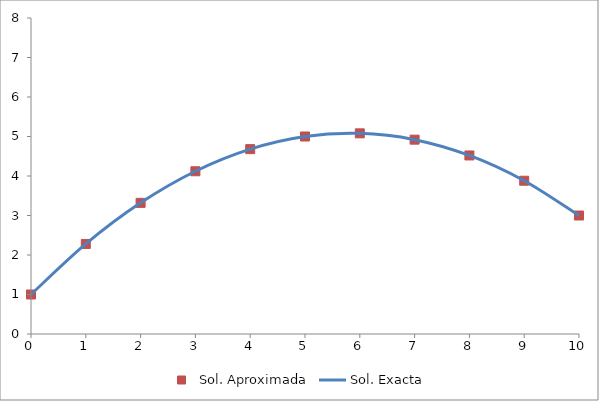
| Category | Sol. Aproximada |
|---|---|
| 0.0 | 1 |
| 1.0 | 2.28 |
| 2.0 | 3.32 |
| 3.0 | 4.12 |
| 4.0 | 4.68 |
| 5.0 | 5 |
| 6.0 | 5.08 |
| 7.0 | 4.92 |
| 8.0 | 4.52 |
| 9.0 | 3.88 |
| 10.0 | 3 |